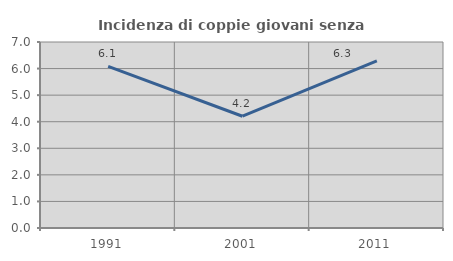
| Category | Incidenza di coppie giovani senza figli |
|---|---|
| 1991.0 | 6.085 |
| 2001.0 | 4.207 |
| 2011.0 | 6.288 |